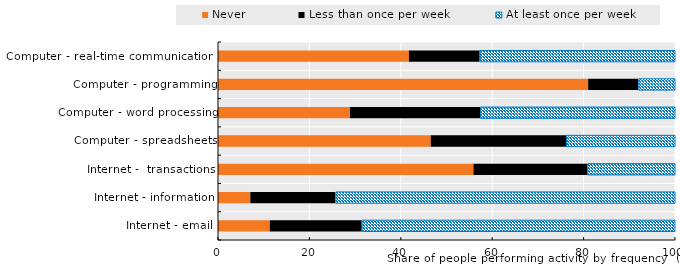
| Category | Never | Less than once per week | At least once per week |
|---|---|---|---|
| Internet - email | 11.322 | 20.128 | 68.55 |
| Internet - information | 7.07 | 18.615 | 74.314 |
| Internet -  transactions | 55.9 | 24.893 | 19.207 |
| Computer - spreadsheets | 46.557 | 29.585 | 23.858 |
| Computer - word processing | 28.89 | 28.453 | 42.657 |
| Computer - programming | 80.995 | 10.981 | 8.024 |
| Computer - real-time communications | 41.773 | 15.501 | 42.726 |